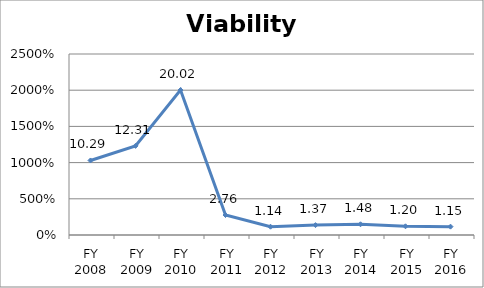
| Category | Viability ratio |
|---|---|
| FY 2016 | 1.153 |
| FY 2015 | 1.203 |
| FY 2014 | 1.484 |
| FY 2013 | 1.366 |
| FY 2012 | 1.144 |
| FY 2011 | 2.76 |
| FY 2010 | 20.021 |
| FY 2009 | 12.309 |
| FY 2008 | 10.293 |